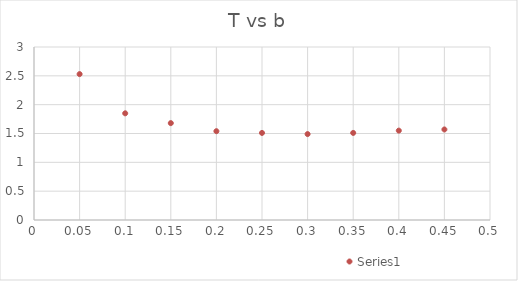
| Category | Series 1 |
|---|---|
| 0.05 | 2.53 |
| 0.1 | 1.85 |
| 0.15 | 1.68 |
| 0.2 | 1.54 |
| 0.25 | 1.51 |
| 0.3 | 1.49 |
| 0.35 | 1.51 |
| 0.4 | 1.55 |
| 0.45 | 1.57 |